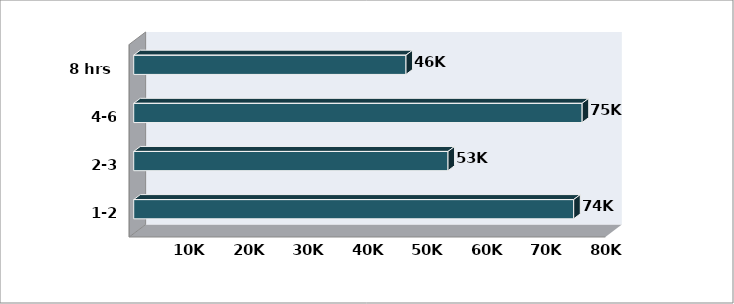
| Category | Series 0 |
|---|---|
| 1-2 hrs | 73918.888 |
| 2-3 hrs | 52804.082 |
| 4-6 hrs | 75336.129 |
| 8 hrs | 45747.784 |